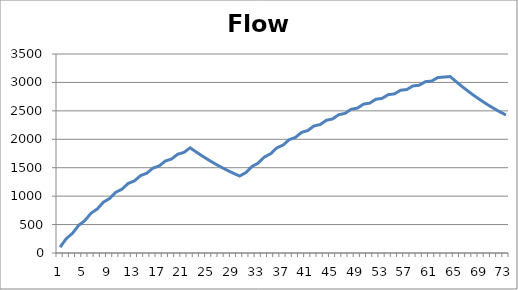
| Category | Series 0 |
|---|---|
| 0 | 102.84 |
| 1 | 253.166 |
| 2 | 346.172 |
| 3 | 486.665 |
| 4 | 569.836 |
| 5 | 700.495 |
| 6 | 773.832 |
| 7 | 894.657 |
| 8 | 958.16 |
| 9 | 1069.15 |
| 10 | 1122.82 |
| 11 | 1223.976 |
| 12 | 1267.812 |
| 13 | 1361.806 |
| 14 | 1402.489 |
| 15 | 1493.331 |
| 16 | 1530.861 |
| 17 | 1618.55 |
| 18 | 1652.927 |
| 19 | 1737.463 |
| 20 | 1768.688 |
| 21 | 1850.071 |
| 22 | 1775.303 |
| 23 | 1703.208 |
| 24 | 1635.121 |
| 25 | 1570.31 |
| 26 | 1510.411 |
| 27 | 1453.789 |
| 28 | 1402.079 |
| 29 | 1353.645 |
| 30 | 1412.964 |
| 31 | 1523.045 |
| 32 | 1580.719 |
| 33 | 1689.154 |
| 34 | 1745.183 |
| 35 | 1849.3 |
| 36 | 1897.002 |
| 37 | 1993.035 |
| 38 | 2033.016 |
| 39 | 2121.328 |
| 40 | 2153.588 |
| 41 | 2234.18 |
| 42 | 2258.72 |
| 43 | 2334.264 |
| 44 | 2357.764 |
| 45 | 2432.268 |
| 46 | 2454.729 |
| 47 | 2527.592 |
| 48 | 2547.506 |
| 49 | 2617.947 |
| 50 | 2635.63 |
| 51 | 2703.839 |
| 52 | 2719.289 |
| 53 | 2785.266 |
| 54 | 2798.484 |
| 55 | 2862.831 |
| 56 | 2875.324 |
| 57 | 2938.947 |
| 58 | 2950.715 |
| 59 | 3013.37 |
| 60 | 3023.807 |
| 61 | 3085.206 |
| 62 | 3094.499 |
| 63 | 3103.333 |
| 64 | 3010.609 |
| 65 | 2921.36 |
| 66 | 2837.325 |
| 67 | 2757.008 |
| 68 | 2682.269 |
| 69 | 2611.249 |
| 70 | 2545.806 |
| 71 | 2483.955 |
| 72 | 2427.494 |